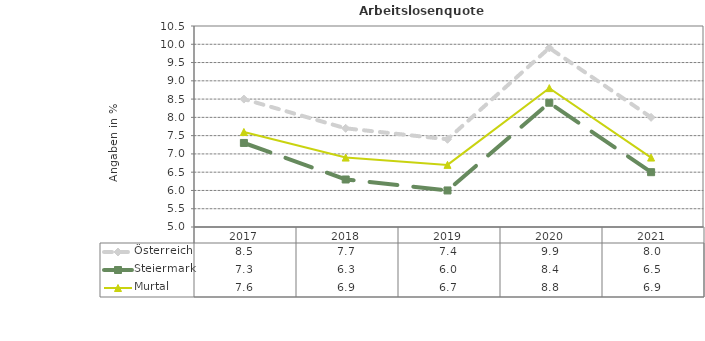
| Category | Österreich | Steiermark | Murtal |
|---|---|---|---|
| 2021.0 | 8 | 6.5 | 6.9 |
| 2020.0 | 9.9 | 8.4 | 8.8 |
| 2019.0 | 7.4 | 6 | 6.7 |
| 2018.0 | 7.7 | 6.3 | 6.9 |
| 2017.0 | 8.5 | 7.3 | 7.6 |